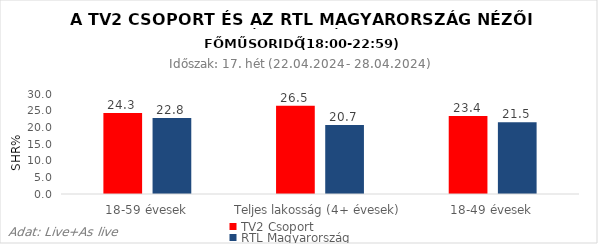
| Category | TV2 Csoport | RTL Magyarország |
|---|---|---|
| 18-59 évesek | 24.3 | 22.8 |
| Teljes lakosság (4+ évesek) | 26.5 | 20.7 |
| 18-49 évesek | 23.4 | 21.5 |